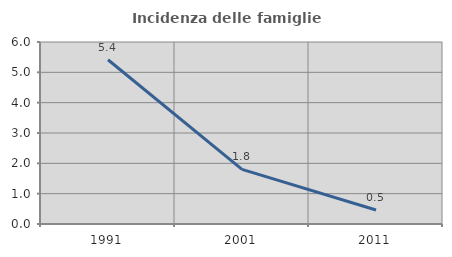
| Category | Incidenza delle famiglie numerose |
|---|---|
| 1991.0 | 5.416 |
| 2001.0 | 1.8 |
| 2011.0 | 0.462 |